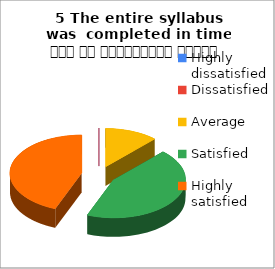
| Category | 5 The entire syllabus was  completed in time समय पर पाठ्यक्रम पूर्ण हुआ |
|---|---|
| Highly dissatisfied | 0 |
| Dissatisfied | 0 |
| Average | 3 |
| Satisfied | 11 |
| Highly satisfied | 11 |